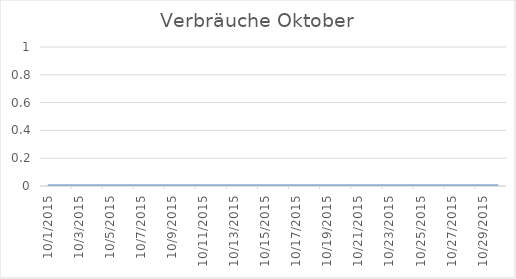
| Category | Series 0 |
|---|---|
| 01/10/2015 | 0 |
| 02/10/2015 | 0 |
| 03/10/2015 | 0 |
| 04/10/2015 | 0 |
| 05/10/2015 | 0 |
| 06/10/2015 | 0 |
| 07/10/2015 | 0 |
| 08/10/2015 | 0 |
| 09/10/2015 | 0 |
| 10/10/2015 | 0 |
| 11/10/2015 | 0 |
| 12/10/2015 | 0 |
| 13/10/2015 | 0 |
| 14/10/2015 | 0 |
| 15/10/2015 | 0 |
| 16/10/2015 | 0 |
| 17/10/2015 | 0 |
| 18/10/2015 | 0 |
| 19/10/2015 | 0 |
| 20/10/2015 | 0 |
| 21/10/2015 | 0 |
| 22/10/2015 | 0 |
| 23/10/2015 | 0 |
| 24/10/2015 | 0 |
| 25/10/2015 | 0 |
| 26/10/2015 | 0 |
| 27/10/2015 | 0 |
| 28/10/2015 | 0 |
| 29/10/2015 | 0 |
| 30/10/2015 | 0 |